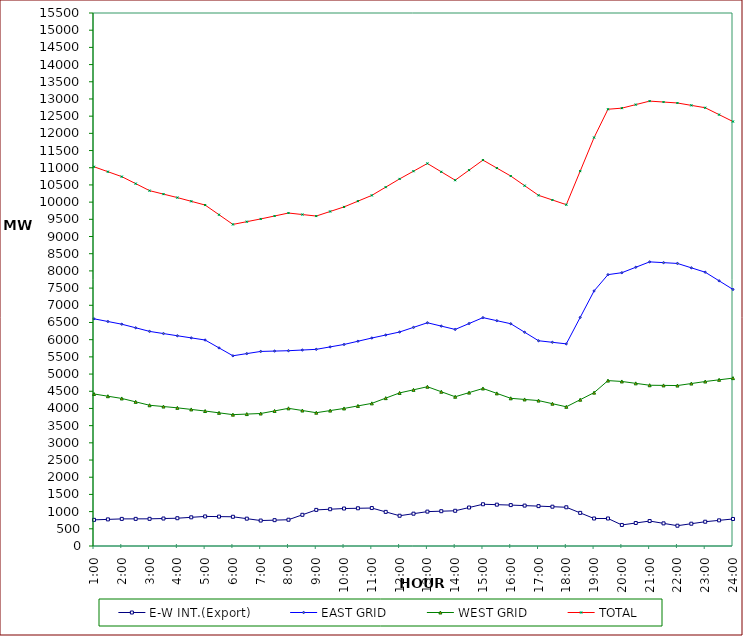
| Category | E-W INT.(Export) | EAST GRID | WEST GRID | TOTAL |
|---|---|---|---|---|
| 1:00 | 760 | 6607 | 4421 | 11028 |
| 1:30 | 774 | 6528.5 | 4356 | 10884.5 |
| 2:00 | 788 | 6450 | 4291 | 10741 |
| 2:30 | 789 | 6345.5 | 4192 | 10537.5 |
| 3:00 | 790 | 6241 | 4093 | 10334 |
| 3:30 | 799 | 6177.5 | 4055.5 | 10233 |
| 4:00 | 808 | 6114 | 4018 | 10132 |
| 4:30 | 834 | 6052 | 3971.5 | 10023.5 |
| 5:00 | 860 | 5990 | 3925 | 9915 |
| 5:30 | 855 | 5761 | 3872.5 | 9633.5 |
| 6:00 | 850 | 5532 | 3820 | 9352 |
| 6:30 | 795 | 5595 | 3836.5 | 9431.5 |
| 7:00 | 740 | 5658 | 3853 | 9511 |
| 7:30 | 752 | 5668.5 | 3928.5 | 9597 |
| 8:00 | 764 | 5679 | 4004 | 9683 |
| 8:30 | 907 | 5699 | 3940 | 9639 |
| 9:00 | 1050 | 5719 | 3876 | 9595 |
| 9:30 | 1070 | 5790 | 3938 | 9728 |
| 10:00 | 1090 | 5861 | 4000 | 9861 |
| 10:30 | 1097 | 5954.5 | 4074 | 10028.5 |
| 11:00 | 1104 | 6048 | 4148 | 10196 |
| 11:30 | 992 | 6135.5 | 4300 | 10435.5 |
| 12:00 | 880 | 6223 | 4452 | 10675 |
| 12:30 | 940 | 6357.5 | 4542 | 10899.5 |
| 13:00 | 1000 | 6492 | 4632 | 11124 |
| 13:30 | 1012 | 6395 | 4486 | 10881 |
| 14:00 | 1024 | 6298 | 4340 | 10638 |
| 14:30 | 1119 | 6469.5 | 4460.5 | 10930 |
| 15:00 | 1214 | 6641 | 4581 | 11222 |
| 15:30 | 1202 | 6552.5 | 4438 | 10990.5 |
| 16:00 | 1190 | 6464 | 4295 | 10759 |
| 16:30 | 1175 | 6216.5 | 4262 | 10478.5 |
| 17:00 | 1160 | 5969 | 4229 | 10198 |
| 17:30 | 1143 | 5923.5 | 4138.5 | 10062 |
| 18:00 | 1126 | 5878 | 4048 | 9926 |
| 18:30 | 963 | 6648 | 4254 | 10902 |
| 19:00 | 800 | 7418 | 4460 | 11878 |
| 19:30 | 800 | 7891 | 4810 | 12701 |
| 20:00 | 612 | 7948 | 4785 | 12733 |
| 20:30 | 669 | 8105.5 | 4730 | 12835.5 |
| 21:00 | 726 | 8263 | 4675 | 12938 |
| 21:30 | 658 | 8240 | 4670.5 | 12910.5 |
| 22:00 | 590 | 8217 | 4666 | 12883 |
| 22:30 | 648 | 8089.5 | 4724.5 | 12814 |
| 23:00 | 706 | 7962 | 4783 | 12745 |
| 23:30 | 746 | 7711.5 | 4832.5 | 12544 |
| 24:00 | 786 | 7461 | 4882 | 12343 |